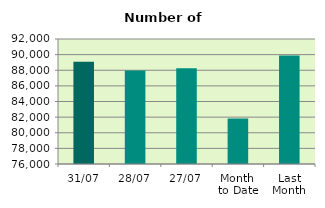
| Category | Series 0 |
|---|---|
| 31/07 | 89086 |
| 28/07 | 87966 |
| 27/07 | 88244 |
| Month 
to Date | 81818 |
| Last
Month | 89884.909 |